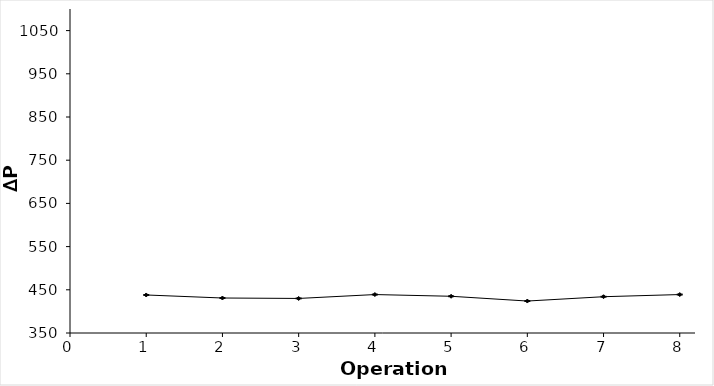
| Category | Acetonitrile |
|---|---|
| 1.0 | 438 |
| 2.0 | 431 |
| 3.0 | 430 |
| 4.0 | 439 |
| 5.0 | 435 |
| 6.0 | 424 |
| 7.0 | 434 |
| 8.0 | 439 |